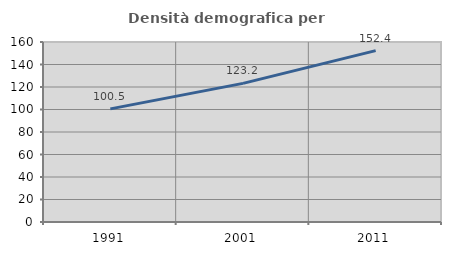
| Category | Densità demografica |
|---|---|
| 1991.0 | 100.534 |
| 2001.0 | 123.206 |
| 2011.0 | 152.355 |